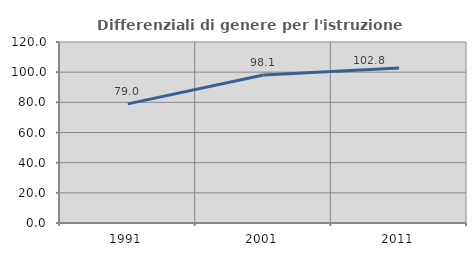
| Category | Differenziali di genere per l'istruzione superiore |
|---|---|
| 1991.0 | 78.963 |
| 2001.0 | 98.083 |
| 2011.0 | 102.805 |